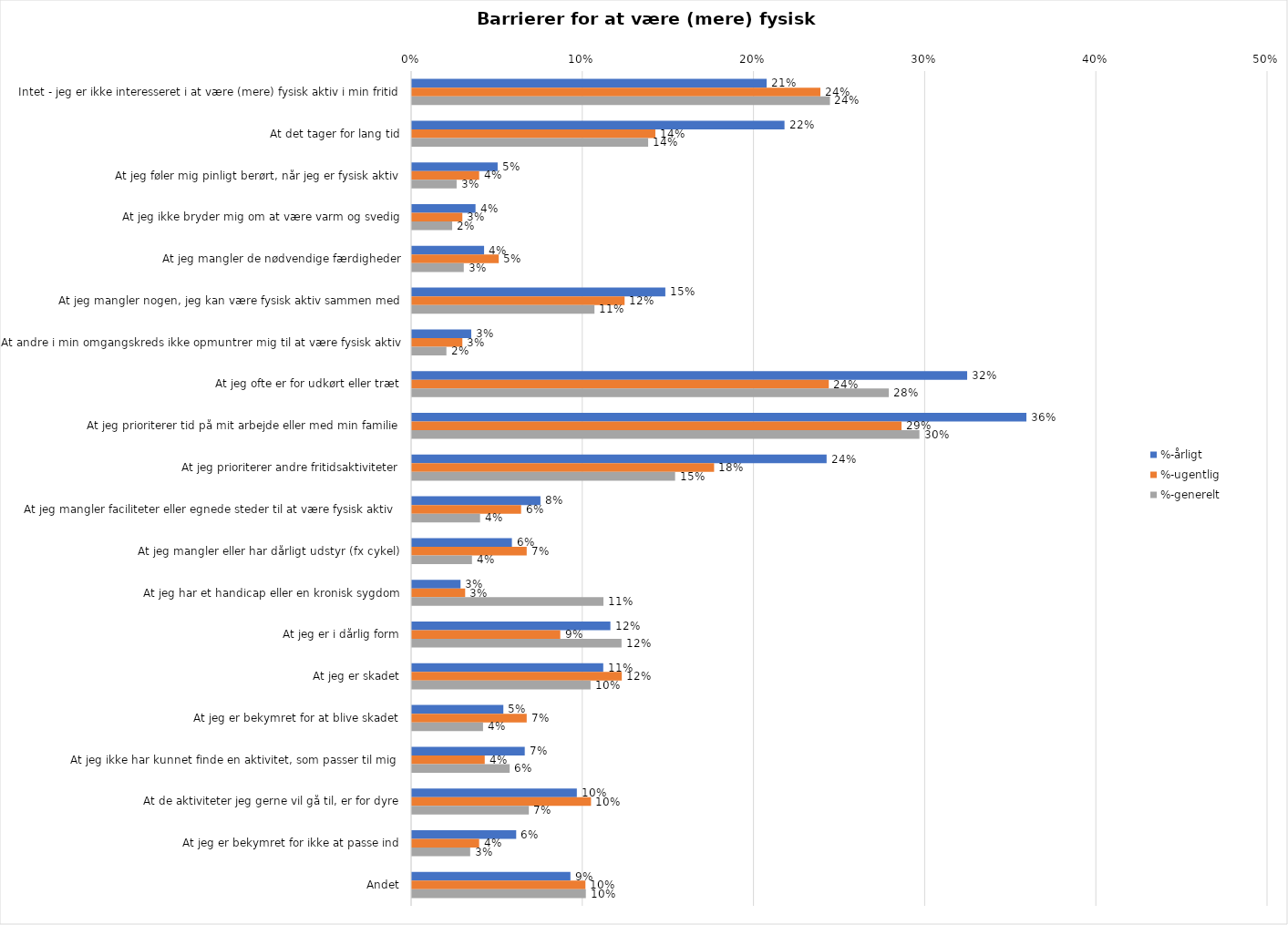
| Category | %-årligt | %-ugentlig | %-generelt |
|---|---|---|---|
| Intet - jeg er ikke interesseret i at være (mere) fysisk aktiv i min fritid | 0.207 | 0.239 | 0.244 |
| At det tager for lang tid | 0.218 | 0.142 | 0.138 |
| At jeg føler mig pinligt berørt, når jeg er fysisk aktiv | 0.05 | 0.039 | 0.026 |
| At jeg ikke bryder mig om at være varm og svedig | 0.037 | 0.029 | 0.023 |
| At jeg mangler de nødvendige færdigheder | 0.042 | 0.051 | 0.03 |
| At jeg mangler nogen, jeg kan være fysisk aktiv sammen med | 0.148 | 0.124 | 0.107 |
| At andre i min omgangskreds ikke opmuntrer mig til at være fysisk aktiv | 0.035 | 0.029 | 0.02 |
| At jeg ofte er for udkørt eller træt | 0.324 | 0.243 | 0.279 |
| At jeg prioriterer tid på mit arbejde eller med min familie | 0.359 | 0.286 | 0.296 |
| At jeg prioriterer andre fritidsaktiviteter | 0.242 | 0.176 | 0.154 |
| At jeg mangler faciliteter eller egnede steder til at være fysisk aktiv  | 0.075 | 0.064 | 0.04 |
| At jeg mangler eller har dårligt udstyr (fx cykel) | 0.058 | 0.067 | 0.035 |
| At jeg har et handicap eller en kronisk sygdom | 0.028 | 0.031 | 0.112 |
| At jeg er i dårlig form | 0.116 | 0.087 | 0.122 |
| At jeg er skadet | 0.112 | 0.123 | 0.104 |
| At jeg er bekymret for at blive skadet | 0.053 | 0.067 | 0.041 |
| At jeg ikke har kunnet finde en aktivitet, som passer til mig  | 0.066 | 0.042 | 0.057 |
| At de aktiviteter jeg gerne vil gå til, er for dyre | 0.096 | 0.105 | 0.068 |
| At jeg er bekymret for ikke at passe ind | 0.061 | 0.039 | 0.034 |
| Andet | 0.093 | 0.101 | 0.102 |